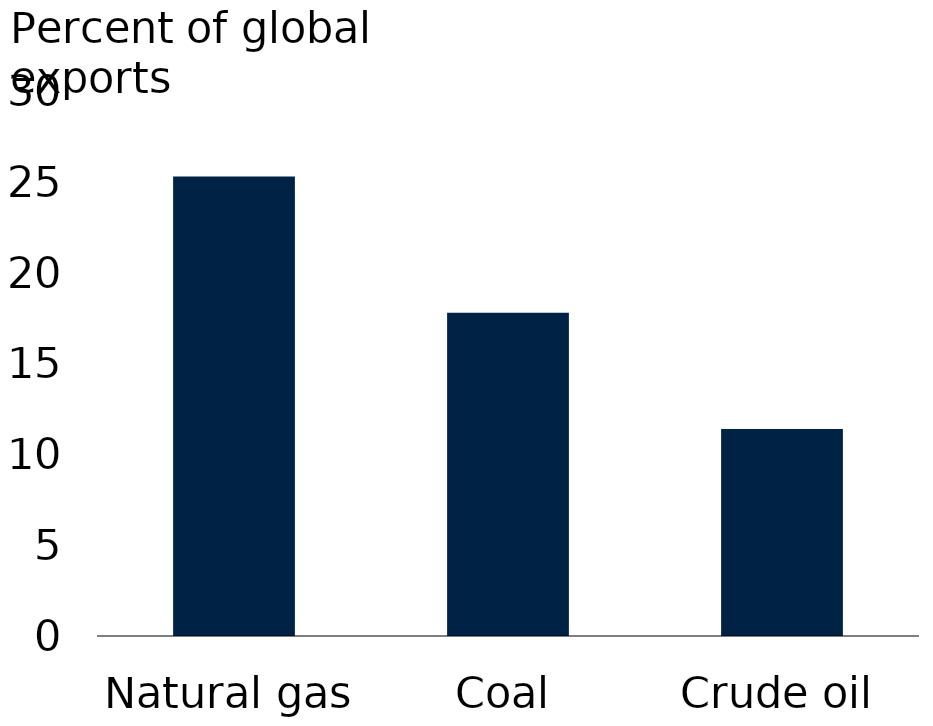
| Category | Series 0 |
|---|---|
| Natural gas | 25.3 |
| Coal | 17.8 |
| Crude oil | 11.4 |